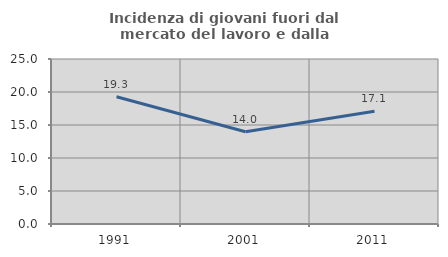
| Category | Incidenza di giovani fuori dal mercato del lavoro e dalla formazione  |
|---|---|
| 1991.0 | 19.286 |
| 2001.0 | 13.988 |
| 2011.0 | 17.087 |